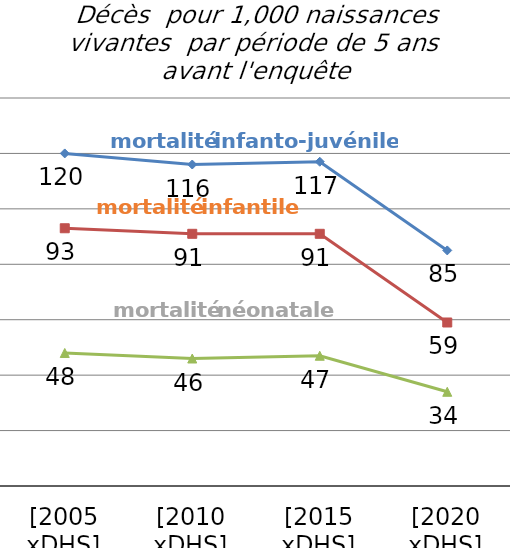
| Category | mortalité infanto-juvénile | mortalité infantile | mortalité néonatale |
|---|---|---|---|
| [2005 xDHS] | 120 | 93 | 48 |
| [2010 xDHS] | 116 | 91 | 46 |
| [2015 xDHS] | 117 | 91 | 47 |
| [2020 xDHS] | 85 | 59 | 34 |